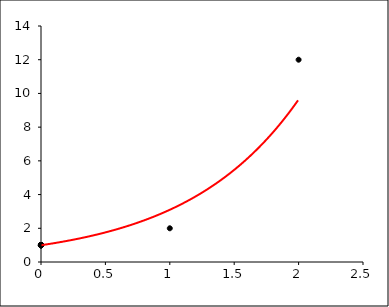
| Category | Series 0 |
|---|---|
| 0.0 | 1 |
| 1.0 | 2 |
| 2.0 | 12 |
| 0.0 | 1 |
| 0.0 | 1 |
| 0.0 | 1 |
| 0.0 | 1 |
| 0.0 | 1 |
| 0.0 | 1 |
| 0.0 | 1 |
| 0.0 | 1 |
| 0.0 | 1 |
| 0.0 | 1 |
| 0.0 | 1 |
| 0.0 | 1 |
| 0.0 | 1 |
| 0.0 | 1 |
| 0.0 | 1 |
| 0.0 | 1 |
| 0.0 | 1 |
| 0.0 | 1 |
| 0.0 | 1 |
| 0.0 | 1 |
| 0.0 | 1 |
| 0.0 | 1 |
| 0.0 | 1 |
| 0.0 | 1 |
| 0.0 | 1 |
| 0.0 | 1 |
| 0.0 | 1 |
| 0.0 | 1 |
| 0.0 | 1 |
| 0.0 | 1 |
| 0.0 | 1 |
| 0.0 | 1 |
| 0.0 | 1 |
| 0.0 | 1 |
| 0.0 | 1 |
| 0.0 | 1 |
| 0.0 | 1 |
| 0.0 | 1 |
| 0.0 | 1 |
| 0.0 | 1 |
| 0.0 | 1 |
| 0.0 | 1 |
| 0.0 | 1 |
| 0.0 | 1 |
| 0.0 | 1 |
| 0.0 | 1 |
| 0.0 | 1 |